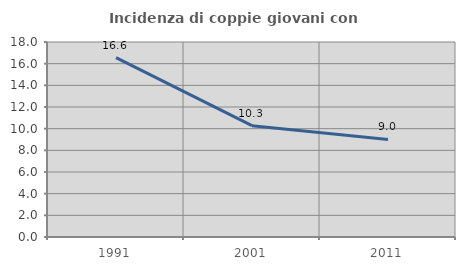
| Category | Incidenza di coppie giovani con figli |
|---|---|
| 1991.0 | 16.561 |
| 2001.0 | 10.275 |
| 2011.0 | 9.001 |